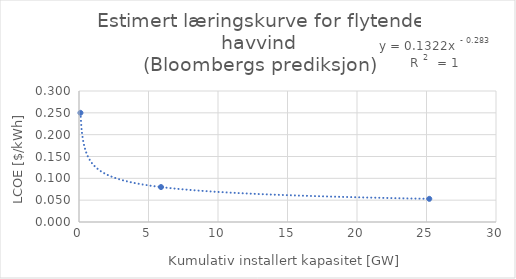
| Category | y |
|---|---|
| 0.105 | 0.25 |
| 5.9 | 0.08 |
| 25.2 | 0.053 |